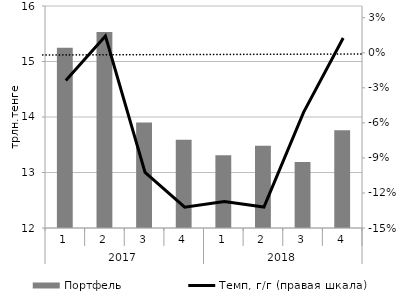
| Category | Портфель |
|---|---|
| 0 | 15.25 |
| 1 | 15.53 |
| 2 | 13.9 |
| 3 | 13.59 |
| 4 | 13.31 |
| 5 | 13.48 |
| 6 | 13.19 |
| 7 | 13.76 |